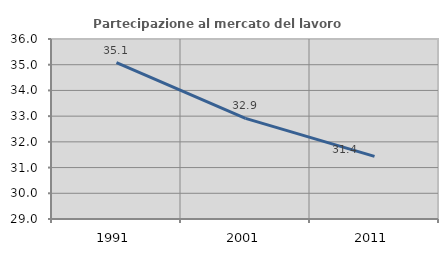
| Category | Partecipazione al mercato del lavoro  femminile |
|---|---|
| 1991.0 | 35.078 |
| 2001.0 | 32.911 |
| 2011.0 | 31.435 |